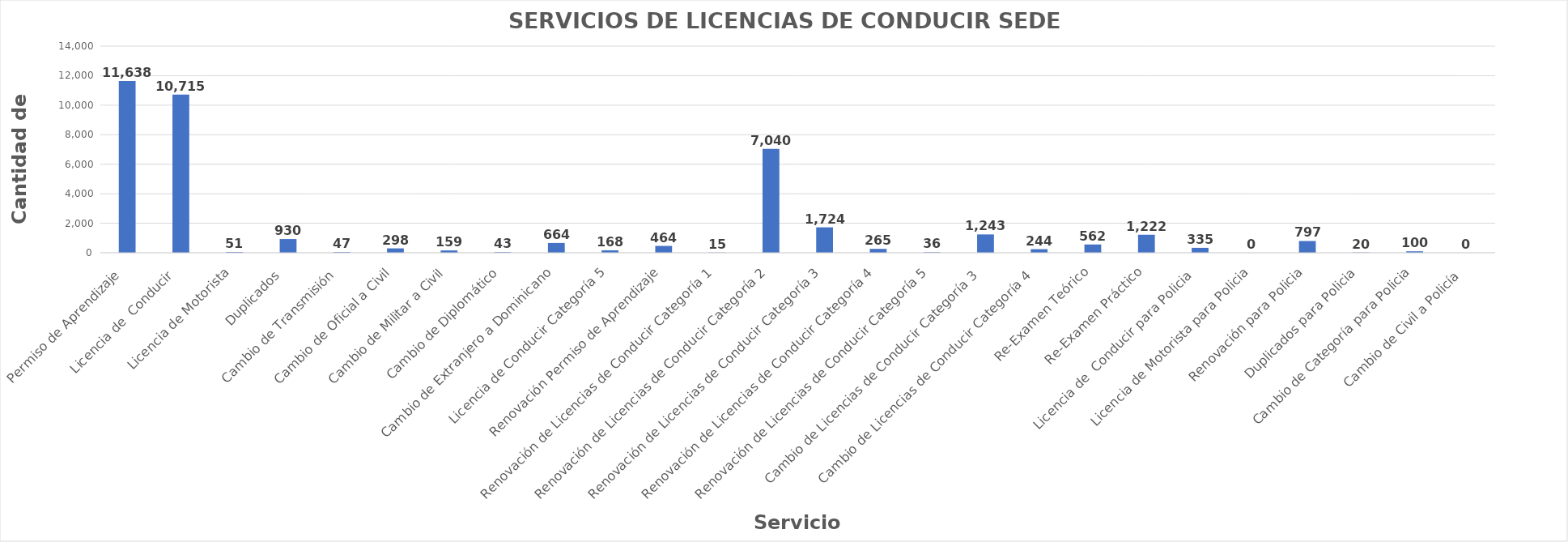
| Category | Series 0 |
|---|---|
| Permiso de Aprendizaje  | 11638 |
| Licencia de  Conducir  | 10715 |
| Licencia de Motorista | 51 |
| Duplicados  | 930 |
| Cambio de Transmisión  | 47 |
| Cambio de Oficial a Civil | 298 |
| Cambio de Militar a Civil | 159 |
| Cambio de Diplomático | 43 |
| Cambio de Extranjero a Dominicano | 664 |
| Licencia de Conducir Categoría 5 | 168 |
| Renovación Permiso de Aprendizaje | 464 |
| Renovación de Licencias de Conducir Categoría 1 | 15 |
| Renovación de Licencias de Conducir Categoría 2 | 7040 |
| Renovación de Licencias de Conducir Categoría 3 | 1724 |
| Renovación de Licencias de Conducir Categoría 4 | 265 |
| Renovación de Licencias de Conducir Categoría 5 | 36 |
| Cambio de Licencias de Conducir Categoría 3  | 1243 |
| Cambio de Licencias de Conducir Categoría 4  | 244 |
| Re-Examen Teórico | 562 |
| Re-Examen Práctico | 1222 |
| Licencia de  Conducir para Policia  | 335 |
| Licencia de Motorista para Policia | 0 |
| Renovación para Policia | 797 |
| Duplicados para Policia | 20 |
| Cambio de Categoría para Policia | 100 |
| Cambio de Civil a Policía  | 0 |